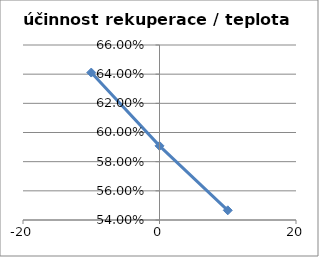
| Category | účinnost rekuperace |
|---|---|
| 10.0 | 0.547 |
| 0.0 | 0.591 |
| -10.0 | 0.641 |